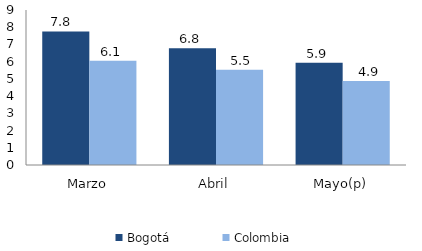
| Category | Bogotá | Colombia |
|---|---|---|
| Marzo | 7.753 | 6.052 |
| Abril | 6.779 | 5.53 |
| Mayo(p) | 5.943 | 4.871 |